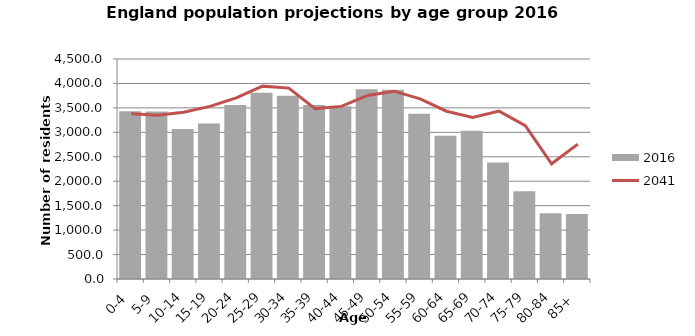
| Category | 2016 |
|---|---|
| 0-4 | 3429.046 |
| 5-9 | 3428.266 |
| 10-14 | 3070.254 |
| 15-19 | 3179.41 |
| 20-24 | 3559.956 |
| 25-29 | 3811.587 |
| 30-34 | 3749.623 |
| 35-39 | 3557.011 |
| 40-44 | 3535.266 |
| 45-49 | 3883.079 |
| 50-54 | 3873.095 |
| 55-59 | 3377.66 |
| 60-64 | 2930.973 |
| 65-69 | 3032.055 |
| 70-74 | 2381.289 |
| 75-79 | 1796.046 |
| 80-84 | 1345.359 |
| 85+ | 1328.092 |